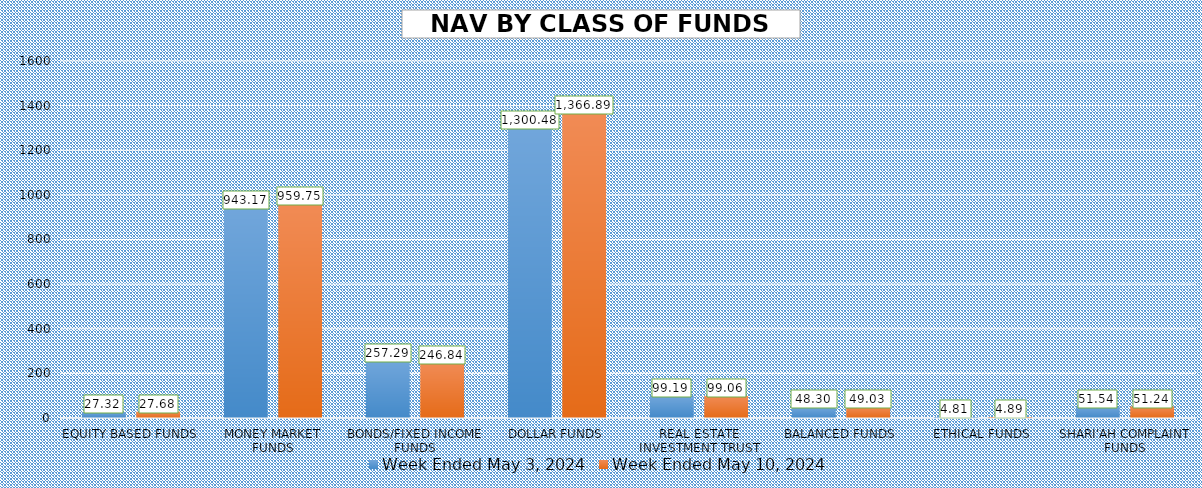
| Category | Week Ended May 3, 2024 | Week Ended May 10, 2024 |
|---|---|---|
| EQUITY BASED FUNDS | 27.319 | 27.676 |
| MONEY MARKET FUNDS | 943.173 | 959.754 |
| BONDS/FIXED INCOME FUNDS | 257.292 | 246.839 |
| DOLLAR FUNDS | 1300.481 | 1366.889 |
| REAL ESTATE INVESTMENT TRUST | 99.185 | 99.061 |
| BALANCED FUNDS | 48.299 | 49.029 |
| ETHICAL FUNDS | 4.808 | 4.887 |
| SHARI'AH COMPLAINT FUNDS | 51.539 | 51.244 |